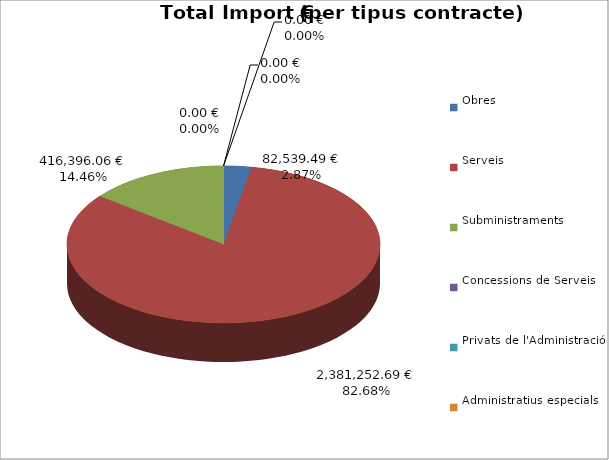
| Category | Total preu
(amb IVA) |
|---|---|
| Obres | 82539.49 |
| Serveis | 2381252.69 |
| Subministraments | 416396.06 |
| Concessions de Serveis | 0 |
| Privats de l'Administració | 0 |
| Administratius especials | 0 |